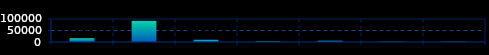
| Category | Series 0 |
|---|---|
|  Mar 15, Jun 15 | 16644 |
|  Jun 15, Sep 15 | 92301 |
|  Sep 15, Dec 15 | 10432 |
|  Dec 15, Mar 16 | 3093 |
|  Mar 16, Jun 16 | 6381 |
|  Jun 16, Sep 16 | 1765 |
|  Sep 16, Dec 16 | 1570 |